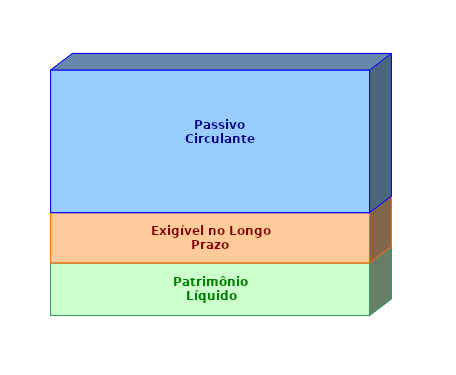
| Category | Patrimônio Líquido | Exigível no Longo Prazo | Passivo Circulante |
|---|---|---|---|
| 0 | 0.215 | 0.204 | 0.581 |